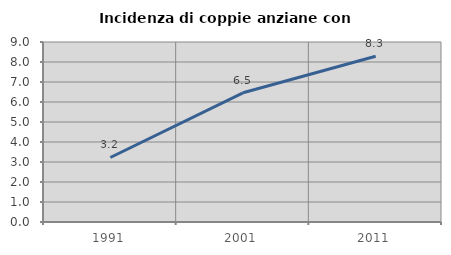
| Category | Incidenza di coppie anziane con figli |
|---|---|
| 1991.0 | 3.226 |
| 2001.0 | 6.461 |
| 2011.0 | 8.284 |